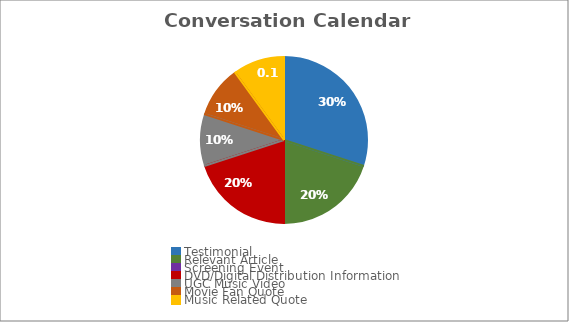
| Category | Series 0 |
|---|---|
| Testimonial | 0.3 |
| Relevant Article | 0.2 |
| Screening Event | 0 |
| DVD/Digital Distribution Information | 0.2 |
| UGC Music Video | 0.1 |
| Movie Fan Quote | 0.1 |
| Music Related Quote | 0.1 |